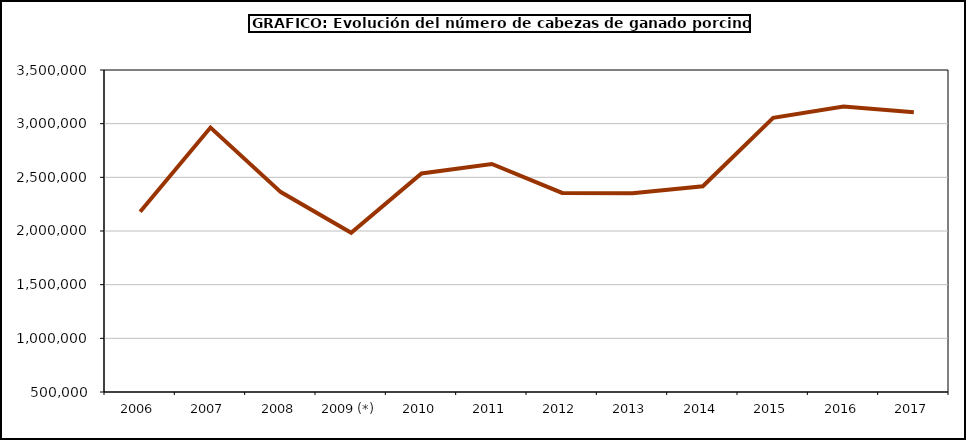
| Category | Total porcino |
|---|---|
| 2006 | 2179321 |
| 2007 | 2963922.516 |
| 2008 | 2362406.6 |
| 2009 (*) | 1983218.02 |
| 2010 | 2536564 |
| 2011 | 2624006 |
| 2012 | 2354690 |
| 2013 | 2351566 |
| 2014 | 2416557.46 |
| 2015 | 3053965.076 |
| 2016 | 3158719.951 |
| 2017 | 3106767.464 |